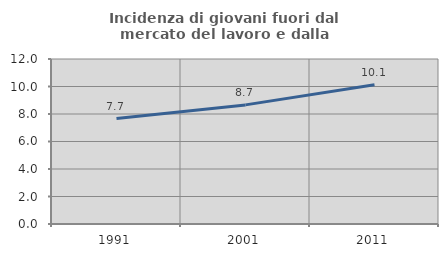
| Category | Incidenza di giovani fuori dal mercato del lavoro e dalla formazione  |
|---|---|
| 1991.0 | 7.666 |
| 2001.0 | 8.662 |
| 2011.0 | 10.131 |